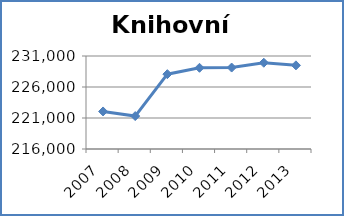
| Category | Knihovní fond |
|---|---|
| 2007.0 | 222054 |
| 2008.0 | 221312 |
| 2009.0 | 228070 |
| 2010.0 | 229099 |
| 2011.0 | 229137 |
| 2012.0 | 229916 |
| 2013.0 | 229492 |